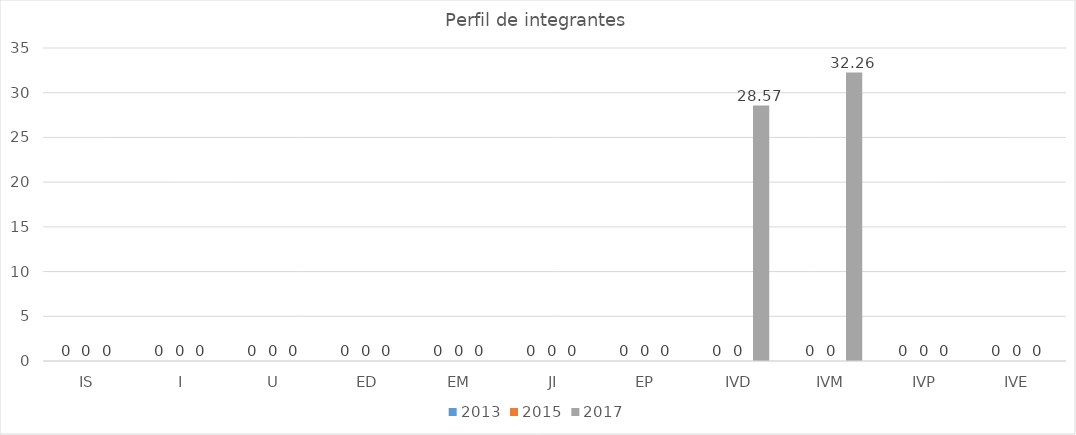
| Category | 2013 | 2015 | 2017 |
|---|---|---|---|
| IS | 0 | 0 | 0 |
| I | 0 | 0 | 0 |
| U | 0 | 0 | 0 |
| ED | 0 | 0 | 0 |
| EM | 0 | 0 | 0 |
| JI | 0 | 0 | 0 |
| EP | 0 | 0 | 0 |
| IVD | 0 | 0 | 28.57 |
| IVM | 0 | 0 | 32.26 |
| IVP | 0 | 0 | 0 |
| IVE | 0 | 0 | 0 |